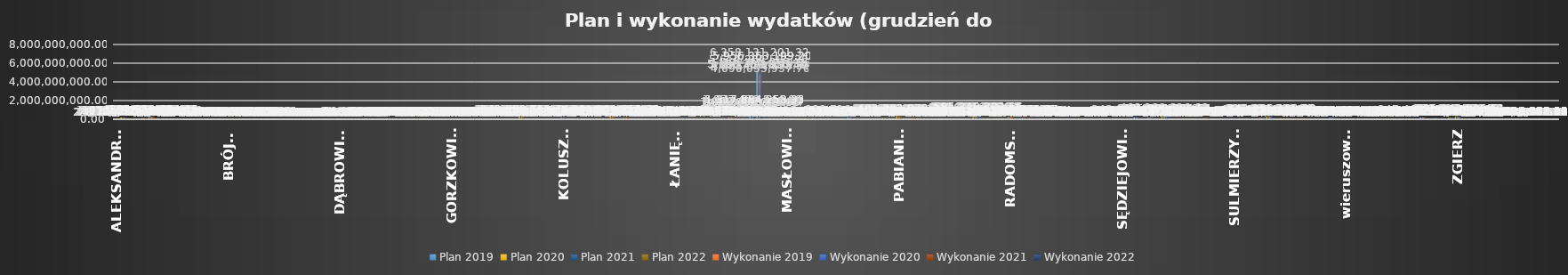
| Category | Plan 2019 | Plan 2020 | Plan 2021 | Plan 2022 | Wykonanie 2019 | Wykonanie 2020 | Series 2 | Series 5 | Wykonanie 2021 | Series 8 | Wykonanie 2022 |
|---|---|---|---|---|---|---|---|---|---|---|---|
| ALEKSANDRÓW | 23580725.07 | 24283173.98 | 27537382.62 | 32676022.12 | 22271493.37 | 24066873.37 |  |  | 25552603.27 |  | 28708478.08 |
| ALEKSANDRÓW ŁÓDZKI | 184972199.44 | 180178053.6 | 197245616.08 | 219583583.02 | 166173997.4 | 178610650.74 |  |  | 182521813.01 |  | 197213521.85 |
| ANDRESPOL | 79122338.95 | 78912447.79 | 90080146.39 | 125184037.34 | 70584346.09 | 78663948.52 |  |  | 78773892.19 |  | 112485549.13 |
| BEDLNO | 29792727.45 | 27233313.84 | 35072441.68 | 50634232.06 | 21806286.3 | 26307018.49 |  |  | 29071427.36 |  | 42759766.91 |
| bełchatowski | 136216881 | 133661317 | 141559567 | 161112251 | 130062824.21 | 132177891.32 |  |  | 136943414.59 |  | 151251469.93 |
| BEŁCHATÓW | 276406011.28 | 288220387.32 | 314438524.58 | 306308675.43 | 272544424.07 | 290809945.13 |  |  | 307808002.97 |  | 299950684.46 |
| BEŁCHATÓW | 61380115.67 | 61840947.8 | 81046335.77 | 156033262.29 | 57992327.34 | 63258396.24 |  |  | 74722805.64 |  | 135560681.76 |
| BĘDKÓW | 15093048 | 17043086.99 | 19072343.44 | 26302219.78 | 14201049.88 | 16683513.2 |  |  | 17406313.6 |  | 23356375.4 |
| BIAŁA | 28893162.06 | 31385929.56 | 36113319.29 | 45841363.47 | 26795207.95 | 31261073.66 |  |  | 33957840.69 |  | 42199553.38 |
| BIAŁA RAWSKA | 61924529.69 | 59863821.91 | 68490581.93 | 89918024.73 | 58937192.75 | 59772995.2 |  |  | 64713093.93 |  | 83390328.24 |
| BIAŁACZÓW | 29136839.38 | 30555957.88 | 38440593.59 | 51104979.43 | 27920334.63 | 30753871.23 |  |  | 34094807.98 |  | 45102223.98 |
| BIELAWY | 25785257.62 | 28711476.21 | 32500070.28 | 40616334.34 | 24614990.49 | 28228588.1 |  |  | 27286196.34 |  | 38277179.95 |
| BŁASZKI | 69507036.89 | 74040650.69 | 79127086.33 | 115109392.75 | 66147073.63 | 72879891.24 |  |  | 75646966.87 |  | 106016785.26 |
| BOLESŁAWIEC | 19864694.42 | 20783357.15 | 21973910.8 | 25908922.83 | 19075303.09 | 21157952.69 |  |  | 21080015.65 |  | 24687075.83 |
| BOLIMÓW | 19780506.46 | 26064648.91 | 27629882.99 | 34502399.81 | 18544383.13 | 23843984.79 |  |  | 25382657.86 |  | 32285854.58 |
| BRĄSZEWICE | 26115750.07 | 27307325.32 | 32366126.06 | 40622897.66 | 24634053.28 | 26641267.42 |  |  | 28276403.8 |  | 34154245.23 |
| BRÓJCE | 39494108.33 | 37951665.97 | 43238002.21 | 53748642.63 | 36640643.34 | 37444910.64 |  |  | 40928506.51 |  | 49536671.35 |
| BRZEZINY | 60755817.43 | 72616715.72 | 67478325.36 | 102360496.77 | 58623558 | 69434389.27 |  |  | 61181819.85 |  | 91568777.55 |
| BRZEZINY | 27752344.38 | 28326717.47 | 38834396.7 | 51311495.21 | 24961750.63 | 29372321.23 |  |  | 28178670.44 |  | 40145497.64 |
| brzeziński | 37763620.28 | 38359205.15 | 44744721.39 | 70852751.89 | 36358207.62 | 37796640.87 |  |  | 41888239.42 |  | 62854629.92 |
| BRZEŹNIO | 34960954.92 | 32248112.37 | 34900839.52 | 48944546.85 | 32480306.41 | 31025936.34 |  |  | 29221612.82 |  | 44866727.68 |
| BUCZEK | 28464346.35 | 25941760.67 | 31670341.16 | 38682894.52 | 26651552.11 | 25639516.06 |  |  | 28278541.18 |  | 34454421.11 |
| BUDZISZEWICE | 12351581.88 | 12364997.08 | 16077009.12 | 24380467.44 | 10866428.2 | 11566737.52 |  |  | 11549956.95 |  | 20535194.05 |
| BURZENIN | 27767729.3 | 30157791.76 | 35003161.13 | 41342289.01 | 26622723.05 | 29765797.48 |  |  | 32498789.75 |  | 38718100.55 |
| CHĄŚNO | 14895372.52 | 16167667.72 | 17525907.51 | 30045296.23 | 14469359.96 | 15950442.31 |  |  | 15102007.93 |  | 27019755.94 |
| CIELĄDZ | 19563451.95 | 22118666.93 | 24635181.72 | 32826627.98 | 18372656.32 | 22001855.24 |  |  | 22645870.24 |  | 30628110.13 |
| CZARNOCIN | 23389343.87 | 24333471.56 | 28782305.28 | 35122950.02 | 22129296.99 | 24825490.44 |  |  | 26718774.42 |  | 31438999.23 |
| CZARNOŻYŁY | 25426980.15 | 20566041.84 | 25746532.51 | 38645056.16 | 23893841.23 | 20437799.72 |  |  | 23442248.06 |  | 34277752.29 |
| CZASTARY | 17991567.03 | 20191797.52 | 23106530.25 | 35475610.71 | 17561803.32 | 19966970.04 |  |  | 22301599.66 |  | 34574622.35 |
| CZERNIEWICE | 31075864.21 | 31739983.19 | 44058386.87 | 35665433.58 | 29925721.83 | 31874917.51 |  |  | 41733832.56 |  | 32821353.98 |
| DALIKÓW | 32255434.75 | 25715308.72 | 28646546.57 | 37084309.65 | 31133444.97 | 26434715.23 |  |  | 27248602.95 |  | 33812253.68 |
| DASZYNA | 38417339.5 | 41217931.77 | 38061515.95 | 41560198.67 | 36067293.66 | 28391948.92 |  |  | 32911512.58 |  | 33560621.59 |
| DĄBROWICE | 13491857.81 | 14062063.66 | 14213797.06 | 21808241.16 | 11330373.53 | 16076353.88 |  |  | 12534206.88 |  | 16848276.67 |
| DŁUTÓW | 26305217.97 | 25768925.72 | 28337445.67 | 40596974.88 | 25467384.74 | 25639884.28 |  |  | 25166020.08 |  | 35055383.93 |
| DMOSIN | 25255572.02 | 24026281.73 | 25286172.57 | 43207905.97 | 24711015.56 | 23859035.84 |  |  | 24210010.83 |  | 37670531.16 |
| DOBROŃ | 40361218.5 | 44429007.53 | 45111481.03 | 60265048.14 | 37742266.47 | 44952020.33 |  |  | 41260078.05 |  | 56984576.37 |
| DOBRYSZYCE | 23425902.45 | 24065433.68 | 33290728.68 | 38656803.73 | 22081013.38 | 23759063.76 |  |  | 31100191.46 |  | 35972038.73 |
| DOMANIEWICE | 24557606.87 | 23633191.61 | 29313501.24 | 34881418.6 | 22182537.98 | 23952385.47 |  |  | 26743547.38 |  | 31365813.36 |
| DRUŻBICE | 26832765.47 | 30362930.89 | 31164994.43 | 42654845.71 | 25572323.61 | 29984782.1 |  |  | 30102024.31 |  | 39111677.21 |
| DRZEWICA | 49994624.32 | 50401829.04 | 59624582.17 | 64890265.21 | 46645716.76 | 49969854.17 |  |  | 50963957.14 |  | 59945372.27 |
| DZIAŁOSZYN | 66817175.89 | 66618656.37 | 71559601.74 | 94427409.02 | 65145081.86 | 67523689.83 |  |  | 68472309.71 |  | 88622582.76 |
| GALEWICE | 39170132.94 | 34749706.01 | 44974858.44 | 48278997.4 | 37273963.12 | 34485670.7 |  |  | 41547928.6 |  | 42946461.08 |
| GIDLE | 27910555.92 | 29816534.07 | 35729668 | 46037401.31 | 25942586.09 | 29902982.66 |  |  | 31620453.79 |  | 43623621.45 |
| GŁOWNO | 59247908.42 | 65336933.7 | 70849016.62 | 87491331.68 | 56817055.31 | 64049248.64 |  |  | 67088444.12 |  | 81637019.57 |
| GŁOWNO | 22811720.4 | 27052714.57 | 27937077.39 | 34217369.88 | 21081303.34 | 24728441.74 |  |  | 24542247.11 |  | 31976237.83 |
| GŁUCHÓW | 29326989.52 | 34461084.59 | 47543600.23 | 52178966.26 | 27460839.99 | 32922737.61 |  |  | 41204355.54 |  | 48323683.44 |
| GODZIANÓW | 14150514.62 | 18320556.31 | 21460508.43 | 20710727.63 | 13502530.13 | 18083270.16 |  |  | 19920757.63 |  | 19325210.04 |
| GOMUNICE | 30319845.3 | 33382471.09 | 41099279.76 | 42907753.4 | 29153143.93 | 32067919.1 |  |  | 38992732.68 |  | 41374263.62 |
| GORZKOWICE | 40689557.06 | 43597611.01 | 52103713 | 64342641.28 | 38170685.23 | 42552933.17 |  |  | 46946237.23 |  | 55638984.9 |
| GOSZCZANÓW | 29357253.8 | 28610349.6 | 31056552.7 | 51863014.52 | 26650988.19 | 27751825.89 |  |  | 29184353.36 |  | 44778869.19 |
| GÓRA ŚW. MAŁGORZATY | 21560299.64 | 23818156.1 | 25206962.94 | 28462964.01 | 20476139.34 | 23693145.31 |  |  | 23896082.26 |  | 25859695.74 |
| GRABICA | 39777221.05 | 40873255.58 | 44320246.59 | 62129300.87 | 36503441.95 | 39544917.27 |  |  | 37230631.93 |  | 53056366.3 |
| GRABÓW | 27111258.96 | 30347231.94 | 31343144.82 | 50261655.09 | 26047430.51 | 29865470.18 |  |  | 29310837.59 |  | 47773899.05 |
| INOWŁÓDZ | 32808809.2 | 28906834.27 | 30555015.79 | 34747109.57 | 31188880.42 | 28921138.41 |  |  | 27683105.52 |  | 30998262.95 |
| JEŻÓW | 18364648.25 | 19123863.1 | 20370032.28 | 32953406.12 | 17713814.42 | 18863247.47 |  |  | 19161791.66 |  | 28992951.89 |
| KAMIEŃSK | 39933074.51 | 38303504.72 | 65320908.27 | 81389743.78 | 36594279.33 | 38663375.87 |  |  | 60204311.6 |  | 73883097.66 |
| KIEŁCZYGŁÓW | 20151545.56 | 20049475.78 | 23566605.62 | 31636663.59 | 18510434.47 | 19511704.73 |  |  | 21054796.34 |  | 28888038.75 |
| KIERNOZIA | 19248213.73 | 20173733.28 | 22920908.21 | 36047183.18 | 18127407.67 | 19701061.78 |  |  | 21403970.71 |  | 32120866.56 |
| KLESZCZÓW | 290343308.07 | 276230061.33 | 319086597.23 | 264558104.64 | 259139323.25 | 261248951.51 |  |  | 283739353.34 |  | 243888719.74 |
| KLONOWA | 15124318.55 | 18004648.55 | 17896454.59 | 24044622.63 | 14207237.27 | 17826643.83 |  |  | 17196008.99 |  | 23339132.74 |
| KLUKI | 21922930.62 | 22560305.26 | 25824988.94 | 37815164.92 | 20294012.23 | 21978508.67 |  |  | 24177628.29 |  | 30563392.33 |
| KOBIELE WIELKIE | 20630834.56 | 21905205.06 | 22775961.98 | 28665080.48 | 19558942.34 | 21709292.15 |  |  | 21614837.63 |  | 27047499.65 |
| KOCIERZEW POŁUDNIOWY | 19978283.63 | 22386394 | 24472403.15 | 41330748.71 | 19090474.29 | 22233137.74 |  |  | 21329987.82 |  | 37583267.19 |
| KODRĄB | 24926166.79 | 22514653.04 | 28983222.26 | 28057060.63 | 23886922.6 | 22208448.25 |  |  | 27030793.05 |  | 26356199.08 |
| KOLUSZKI | 148360027.96 | 131953610.5 | 142047810.7 | 168711933.94 | 135187248.96 | 125292687.73 |  |  | 130648851.25 |  | 153547422.27 |
| KONOPNICA | 21739477.67 | 20513754.86 | 25042144.83 | 32610489 | 21122392.43 | 20363192.58 |  |  | 24029447.62 |  | 29673755.44 |
| KONSTANTYNÓW ŁÓDZKI | 88732394.86 | 95209453.74 | 107783879.27 | 113736142.45 | 83515044.77 | 93146943.75 |  |  | 100875135.15 |  | 102531815.83 |
| KOWIESY | 17259469.52 | 17544629.84 | 19704630.86 | 25920787.44 | 16779312.16 | 17406283.04 |  |  | 18274393.62 |  | 24285818.75 |
| KROŚNIEWICE | 44874781.45 | 42085142.92 | 48763096.4 | 66147326.85 | 41223040.83 | 41923035.7 |  |  | 46309503.97 |  | 60882603.66 |
| KRZYŻANÓW | 26055948.47 | 23716554.83 | 27165664.25 | 44822579.84 | 25096200.48 | 24165507.73 |  |  | 18264759.51 |  | 39456568.52 |
| KSAWERÓW | 54894131.25 | 54137935.71 | 68715666.78 | 68005502.98 | 45242262.95 | 53861774.74 |  |  | 61862639.47 |  | 53309263.76 |
| KUTNO | 239179659.98 | 256693393.17 | 261822461.04 | 288396156.21 | 221201157.06 | 243406569.14 |  |  | 243456058.77 |  | 264160015.39 |
| KUTNO | 41710974.23 | 45397825.21 | 52685289.34 | 62315524.63 | 39740937.45 | 45289992.69 |  |  | 50396086.61 |  | 58008710.09 |
| kutnowski | 132593386.61 | 137448119.42 | 150318951.38 | 178947427.06 | 124347364.92 | 135761631.07 |  |  | 142073893.72 |  | 163590810.48 |
| LGOTA WIELKA | 26256734.62 | 26311550.87 | 31196506.76 | 35401589.62 | 24956870.69 | 25732552.89 |  |  | 28944410.39 |  | 30591051.36 |
| LIPCE REYMONTOWSKIE | 18525179.92 | 22115332.6 | 30790805.33 | 28124378.58 | 15952935.14 | 20305604.86 |  |  | 21504963.61 |  | 23416117.53 |
| LUBOCHNIA | 51535346.61 | 53147420.65 | 50654835.78 | 56923266.48 | 48324830.92 | 52555288.88 |  |  | 46161294.73 |  | 50224092.21 |
| LUTOMIERSK | 43055415.31 | 45571643.39 | 57304580.86 | 66150984.67 | 39808459.19 | 45068352.23 |  |  | 45159200.89 |  | 52600423.54 |
| LUTUTÓW | 27682575.32 | 25334382.23 | 32853704.3 | 42839036.07 | 25528245.93 | 25242080.96 |  |  | 27974736.35 |  | 38671490.65 |
| ŁADZICE | 30473549.96 | 24498291.38 | 25091807.99 | 35369615.72 | 28198549.96 | 24406431.2 |  |  | 23665861.94 |  | 31749804.77 |
| ŁANIĘTA | 11938224.6 | 13939194.1 | 18034303.08 | 34989213.46 | 10860393.76 | 13242213.9 |  |  | 14916987.73 |  | 16198280.73 |
| ŁASK | 132040739.91 | 125129776.83 | 141849644.65 | 171490513.43 | 125919010.64 | 123064319.66 |  |  | 133662132.62 |  | 153343281.47 |
| łaski | 51450902.4 | 50489721.05 | 65032075.6 | 67764002.14 | 47867218.16 | 50610086.52 |  |  | 58132326.75 |  | 56991344.57 |
| ŁĘCZYCA | 73230697 | 72288233.97 | 78502451.6 | 78976814.46 | 69717223.44 | 71864741.13 |  |  | 74717961.29 |  | 71950751.99 |
| ŁĘCZYCA | 43914718.13 | 52724606.05 | 52719332.33 | 64124242.29 | 39905461.82 | 48519153.79 |  |  | 43142216.16 |  | 55407110.92 |
| łęczycki | 63508287.17 | 67965211.51 | 75675273.39 | 86321142.41 | 60235412.59 | 65989096.08 |  |  | 70142241.54 |  | 79955019.12 |
| ŁĘKI SZLACHECKIE | 16149154.66 | 19058658.7 | 19590138.18 | 29795429.51 | 15396527.66 | 18277286.37 |  |  | 17888563.7 |  | 25606918.66 |
| łowicki | 106424869.47 | 103361567.03 | 124401838.45 | 144572914.45 | 99548684.99 | 100850796.05 |  |  | 104332796.16 |  | 126174683.27 |
| ŁOWICZ | 162207954.31 | 178930916.72 | 183744635.43 | 200099497.02 | 152708558.58 | 177879300.05 |  |  | 165382672.6 |  | 182573898.22 |
| ŁOWICZ | 47225093.08 | 45178932.43 | 48172430.86 | 60691099.62 | 43826093.73 | 44789882.13 |  |  | 42132513.52 |  | 55628150.88 |
| łódzki wschodni | 67473947.45 | 78161635.58 | 85616408.23 | 111232405.49 | 61065549.14 | 78291553.81 |  |  | 74158652.23 |  | 95349740.55 |
| łódzkie | 1065060099 | 1093106329 | 1169420446 | 1377470544 | 956883138.51 | 1097732100.67 |  |  | 1066808157.47 |  | 1317884253.33 |
| Łódź | 5156257815.51 | 5086453850.49 | 5614364585.36 | 6358131201.32 | 4690053937.7 | 4921024478.31 |  |  | 5227945218.36 |  | 5956363199.2 |
| ŁUBNICE | 22412388.97 | 23788023.48 | 22514808.1 | 27048950.14 | 21657320.55 | 23307147.67 |  |  | 21282501.22 |  | 24816974.87 |
| ŁYSZKOWICE | 37268731.86 | 33693201.03 | 44118945.72 | 46177801.93 | 33442976.07 | 32825546.35 |  |  | 34856631.91 |  | 40737196.9 |
| MAKÓW | 40950081.17 | 42441604 | 43279521.42 | 45434902.12 | 36897295.44 | 42565994.87 |  |  | 38283322.08 |  | 37608972.2 |
| MASŁOWICE | 22943413.34 | 25237995.34 | 24311200.79 | 32265154.7 | 20794052.67 | 25199037.02 |  |  | 21888490.52 |  | 30345281.44 |
| MNISZKÓW | 23668171.59 | 27097370.92 | 30115663.17 | 34656832.64 | 22118483.45 | 25375369.05 |  |  | 27553355.77 |  | 31899362.88 |
| MOKRSKO | 26122853.4 | 30013239.49 | 32906588.02 | 44437800.45 | 24957617.22 | 29796298.2 |  |  | 31670346.24 |  | 41161700.25 |
| MOSZCZENICA | 73216437.19 | 74066374.8 | 89943779.24 | 106232809.27 | 68262857.59 | 70088864.8 |  |  | 81898159.03 |  | 100886351.98 |
| NIEBORÓW | 49241051.78 | 47220602.53 | 53988597.06 | 69113891.43 | 46340766.5 | 47422279.58 |  |  | 51021889.43 |  | 61636236.66 |
| NOWA BRZEŹNICA | 21864756.3 | 23606799.49 | 31555380.71 | 46937694.91 | 21417404.68 | 23965597.91 |  |  | 25015368.3 |  | 28971339.05 |
| NOWE OSTROWY | 19341004.35 | 19745738.73 | 20563516.45 | 38436239.36 | 17380837.35 | 19635398.9 |  |  | 18782828.52 |  | 32943629.83 |
| NOWOSOLNA | 36198051.26 | 36942608.31 | 46879089.08 | 50478411.32 | 32865357.97 | 36898176.41 |  |  | 42415663.76 |  | 46946264.35 |
| NOWY KAWĘCZYN | 16988372.57 | 18740131.52 | 20890186.98 | 24333848.62 | 16562299.55 | 18446475.55 |  |  | 20294733.94 |  | 23688596.29 |
| OPOCZNO | 158503598.06 | 164629247.4 | 232493883.17 | 239716134.18 | 150510195.58 | 159538774.09 |  |  | 209072247.7 |  | 215124129.79 |
| opoczyński | 89196212 | 90522778.04 | 102578670.24 | 114489934.2 | 80632730.96 | 90233606.18 |  |  | 92852810.52 |  | 103924350.69 |
| OPORÓW | 13477737.7 | 14350337.82 | 13986339.58 | 18196106.84 | 12537139.28 | 14073590.4 |  |  | 12917037.55 |  | 13692041.29 |
| OSJAKÓW | 31983509.46 | 29376791.63 | 34755238 | 48392845.88 | 29239381.61 | 29788035.24 |  |  | 30562549.73 |  | 41138486.75 |
| OSTRÓWEK | 22553293.6 | 23541716.99 | 27263291.26 | 46412338.4 | 21582127.02 | 23706634.78 |  |  | 25911056.99 |  | 42786629.4 |
| OZORKÓW | 102303054.78 | 109522525.26 | 104986096.65 | 113178093.56 | 97935581.58 | 100009924.23 |  |  | 98933568.12 |  | 107389908.87 |
| OZORKÓW | 36331965.72 | 37772163.91 | 40086772.33 | 48692870.32 | 32300717.42 | 37888933.55 |  |  | 36012177.69 |  | 44672124.05 |
| PABIANICE | 329670796.72 | 348941828.43 | 386361621.85 | 427451679.18 | 293029232.53 | 310008592.28 |  |  | 363783090.68 |  | 403262079.31 |
| PABIANICE | 55896459.61 | 54161354.08 | 63834593.06 | 69228361.01 | 53656495.02 | 53513339.74 |  |  | 56678267.6 |  | 62545519.37 |
| pabianicki | 119538064.91 | 119838375.67 | 131717347.9 | 142774789.37 | 114483354 | 119607623.62 |  |  | 122342492.31 |  | 135042833.95 |
| pajęczański | 51843124.82 | 48737738.62 | 59170100.96 | 65019510.02 | 49029042.21 | 48697811.1 |  |  | 54909468.95 |  | 62137660.32 |
| PAJĘCZNO | 51767642.07 | 59569446.3 | 69674624.95 | 80566288.18 | 47906750.8 | 59242929.17 |  |  | 59724661.55 |  | 70549619.69 |
| PARADYŻ | 26671126.53 | 34730239.39 | 31321296.68 | 40083051.27 | 25951874.79 | 34200023.11 |  |  | 30327367.76 |  | 39037608.33 |
| PARZĘCZEW | 29737441.48 | 29312322.32 | 29642834.04 | 48684394.47 | 27784299.65 | 29541009.6 |  |  | 28250809.96 |  | 39712575.01 |
| PĄTNÓW | 37600921.24 | 33191742.22 | 35224112.53 | 50450862.83 | 34408183.86 | 33127115.93 |  |  | 30900563.3 |  | 45336155.05 |
| PĘCZNIEW | 22027798.17 | 19359975.7 | 21567689.48 | 32119621.23 | 19911219.61 | 18470787.71 |  |  | 20603678.6 |  | 30229524.9 |
| PIĄTEK | 30405452.27 | 33725192 | 34405285.88 | 45082089.9 | 28320273.9 | 32951471.02 |  |  | 32379410.94 |  | 42298931.19 |
| piotrkowski | 95381122.97 | 81335972.71 | 103617182.25 | 111533219.65 | 85538168.16 | 80639996.71 |  |  | 90751395.52 |  | 104282078.77 |
| Piotrków Trybunalski | 502633363.98 | 521891117.52 | 556309185.54 | 610523799.52 | 486765146.77 | 525491848.42 |  |  | 530366027.73 |  | 585348302.56 |
| PODDĘBICE | 111305279.44 | 101924644.23 | 85513197.25 | 120238753.29 | 107787082.36 | 102104081.36 |  |  | 77970654.62 |  | 103421577.85 |
| poddębicki | 49244436.99 | 48738714.67 | 54853645.31 | 65657661.76 | 47386116.77 | 47872273.97 |  |  | 48067149.1 |  | 59477487.1 |
| POŚWIĘTNE | 17465245.4 | 15859875.94 | 17430084.51 | 26474705.29 | 16175837.86 | 15904629.06 |  |  | 15709392.73 |  | 24165299.09 |
| PRZEDBÓRZ | 37765318.15 | 38192131.07 | 38119910.59 | 51744859.94 | 36070010.31 | 37766024.92 |  |  | 37015537.67 |  | 49048138.4 |
| RADOMSKO | 266044105.68 | 234266117.63 | 278681125.22 | 307282459.08 | 242510898.69 | 246109867.85 |  |  | 253382346 |  | 281496806.37 |
| RADOMSKO | 29088155.03 | 30081395.11 | 39139525.58 | 46151841.5 | 27618312.06 | 29585172.15 |  |  | 35726319.24 |  | 41987396.78 |
| radomszczański | 130888393.5 | 128057773.27 | 141777979.36 | 166568346.91 | 117684611.22 | 126823306.21 |  |  | 130181952.14 |  | 153991842.24 |
| RAWA MAZOWIECKA | 102239926.85 | 109161339.48 | 130063395.11 | 133486738.97 | 96005264.5 | 101915466.5 |  |  | 112391532.18 |  | 125464919 |
| RAWA MAZOWIECKA | 46957489.46 | 46864264.81 | 56689396.77 | 75138334.98 | 42916162.57 | 49726975.58 |  |  | 52641760.03 |  | 67710756.45 |
| rawski | 75381564 | 71216613 | 92127572 | 123320605.88 | 70675562.88 | 67858236.61 |  |  | 84685349.09 |  | 112792282.8 |
| REGNÓW | 8868526.6 | 9844929.44 | 11017166.87 | 20369737.36 | 8624436.19 | 9644619.13 |  |  | 9914039.5 |  | 19169054.49 |
| RĘCZNO | 18412171.99 | 17326611.9 | 19784877.85 | 23065031.47 | 17523729.58 | 16989600.87 |  |  | 17879454.07 |  | 20818212.95 |
| ROGÓW | 24633268.1 | 24680257.05 | 28950776.81 | 38677987.15 | 23538638.93 | 24691297.45 |  |  | 27646495.31 |  | 35394804.69 |
| ROKICINY | 36512704.69 | 33960680.67 | 38816735.2 | 47684952.73 | 31945515.62 | 34352945.63 |  |  | 33991633.48 |  | 42319623.3 |
| ROZPRZA | 64587799.47 | 63114927.89 | 76140519.61 | 83194483.27 | 59539596.76 | 62047857.48 |  |  | 70156251.07 |  | 73816174.96 |
| RUSIEC | 24502768 | 25990000 | 29650000 | 46252126.78 | 23356088.77 | 26124303.65 |  |  | 28892072.4 |  | 44815445.2 |
| RZĄŚNIA | 61572544.73 | 55010143.96 | 74588539.16 | 71859790.21 | 54411066.97 | 55430090.57 |  |  | 62324192.14 |  | 62095348.99 |
| RZECZYCA | 35500152 | 34943230 | 34626085 | 53079422 | 31478923.51 | 28308183.8 |  |  | 27759404.48 |  | 42092800.19 |
| RZGÓW | 105261216.96 | 77466285.11 | 81117846.58 | 97931277.62 | 100432620.36 | 81356742.57 |  |  | 72088649.74 |  | 87406766.37 |
| SADKOWICE | 26790741.6 | 29357261.59 | 31619571.48 | 46177615.94 | 25981387.49 | 29247799.38 |  |  | 29370404.53 |  | 40191450.9 |
| SĘDZIEJOWICE | 33465441.33 | 36116778.09 | 42921591.72 | 48975022.73 | 29265721.55 | 35220719.72 |  |  | 41180664.95 |  | 45526328.33 |
| SIEMKOWICE | 26659800.98 | 26525670.81 | 28225666.76 | 35855802.63 | 24427337.9 | 26245508.06 |  |  | 27149247.46 |  | 33664668.7 |
| SIERADZ | 193020105.74 | 197560148.97 | 225804851.07 | 242975998.37 | 178506428.58 | 196631465.5 |  |  | 209466421.72 |  | 221904035.99 |
| SIERADZ | 50562254.52 | 59182897.11 | 64676023.78 | 84495724.34 | 48495313.38 | 58271054.84 |  |  | 60382132.41 |  | 75679576.21 |
| sieradzki | 155707482.45 | 164729581.06 | 170901099.92 | 190914964.56 | 144480832.23 | 162522709.06 |  |  | 160833829.42 |  | 174596109.45 |
| SKIERNIEWICE | 43742246.2 | 50519533.02 | 54583769.72 | 68477605.75 | 40438272.18 | 49340048.23 |  |  | 51726249.28 |  | 61176003.49 |
| SKIERNIEWICE | 335293057.86 | 367069537.74 | 395302403.66 | 469199816.68 | 313317560.61 | 361812640.29 |  |  | 375297682.4 |  | 425938386.54 |
| skierniewicki | 29150001 | 31473192 | 30958352 | 58056753.52 | 27508549.82 | 30696078.38 |  |  | 28856125.53 |  | 52172090.55 |
| SKOMLIN | 16678595.61 | 20520966.43 | 23425663.19 | 26246815.29 | 14900344.08 | 19318437.75 |  |  | 20165639.77 |  | 22228852.32 |
| SŁAWNO | 44456283.31 | 41867622.9 | 43589298.78 | 53283006 | 43781399.48 | 41933138.49 |  |  | 41614194.25 |  | 51318160.01 |
| SŁUPIA | 15444847.62 | 14162241.98 | 14275928.7 | 20687840.38 | 13376570.09 | 13502021.12 |  |  | 12602824.01 |  | 17374332.66 |
| SOKOLNIKI | 38146143.2 | 29253321.19 | 32656659.26 | 43728465.1 | 34648050.86 | 29957149.06 |  |  | 26692034.96 |  | 39106594.79 |
| STRYKÓW | 108594454.11 | 109127890.86 | 119798354.74 | 145224402.18 | 95083895.24 | 110828795.4 |  |  | 109346827.04 |  | 118913704.66 |
| STRZELCE | 21426235.68 | 26633273.75 | 27323522.9 | 35275082.18 | 19197473.01 | 26202567.06 |  |  | 21980531.21 |  | 29796181.95 |
| STRZELCE WIELKIE | 24733043.34 | 23400288.97 | 27170308.67 | 37088837.68 | 22854575.55 | 22785731.08 |  |  | 24893560.51 |  | 34552211.12 |
| SULEJÓW | 102904201.31 | 89196985.04 | 116468403.62 | 128915528.53 | 76699121.43 | 88884202.77 |  |  | 106052987.33 |  | 111264642.8 |
| SULMIERZYCE | 52053302.95 | 50308706.23 | 62481960.09 | 100317268.89 | 49002751.07 | 51106639.31 |  |  | 54965278.2 |  | 88808246.35 |
| SZADEK | 35748763.43 | 36200477.33 | 41230601.05 | 50854845 | 33623967.94 | 35745427.34 |  |  | 38620771.79 |  | 47709744.74 |
| SZCZERCÓW | 72230336.79 | 85512766.29 | 83539869.04 | 105911234.05 | 66511429.18 | 86016577.67 |  |  | 73827886.49 |  | 91380638.19 |
| ŚWINICE WARCKIE | 21870058.15 | 20247219.44 | 21116352.01 | 27745146.55 | 18567791.34 | 22290653.92 |  |  | 19855629.57 |  | 25226033.94 |
| tomaszowski | 143665613.5 | 159858694.96 | 188086707.07 | 176127169.65 | 135494714.81 | 157639606.32 |  |  | 182476631.6 |  | 170937406.63 |
| TOMASZÓW MAZOWIECKI | 313735365.53 | 314158755.63 | 312691046.73 | 355954890.58 | 308412733.27 | 313400574.8 |  |  | 302593791.13 |  | 342266162.3 |
| TOMASZÓW MAZOWIECKI | 70448522.48 | 70227401.5 | 73523981.05 | 88763002.19 | 63719873.11 | 67178983.79 |  |  | 68046133.95 |  | 79264514.69 |
| TUSZYN | 69077815.36 | 75480276.4 | 85327568.93 | 91292400.36 | 63792086.77 | 71821417.24 |  |  | 72141068.36 |  | 80972565.59 |
| UJAZD | 46926079.32 | 54220799.03 | 67632972.92 | 78973440.03 | 45089800.06 | 54628191.61 |  |  | 64172297.51 |  | 74431076.42 |
| UNIEJÓW | 103571358.68 | 57822273.82 | 89787939.65 | 108075757.81 | 91607831.16 | 55903858.31 |  |  | 73287449.57 |  | 78431129.62 |
| WARTA | 75909349.6 | 67109474.2 | 73805405.82 | 107278512.52 | 72742557.04 | 66038917.67 |  |  | 66543814.77 |  | 101103872.21 |
| WARTKOWICE | 36214750.28 | 40920761.86 | 45648237.98 | 65851324.48 | 33891435.87 | 38853676.75 |  |  | 37730950.34 |  | 54939094.19 |
| WIDAWA | 39632554.32 | 41680994.78 | 43163671.19 | 62560899.71 | 33948029.97 | 40111234.97 |  |  | 39899410.84 |  | 52162370.73 |
| WIELGOMŁYNY | 23481233.87 | 23622444.14 | 25763533.6 | 37607054.8 | 21628013.05 | 24317534 |  |  | 24350066.37 |  | 34533133.53 |
| WIELUŃ | 159310896.35 | 155805708.79 | 189168354.43 | 185170822.22 | 149803357.4 | 156240511.04 |  |  | 160834752.87 |  | 168513010.41 |
| wieluński | 103977209.87 | 103922499.83 | 117495984.16 | 140331773.58 | 100881505.32 | 103283944.7 |  |  | 107820373.12 |  | 134178248.99 |
| wieruszowski | 45697592 | 60779750 | 59609021 | 63648863.79 | 44020123.91 | 60362482.63 |  |  | 57036791.55 |  | 60088424.22 |
| WIERUSZÓW | 82833416.49 | 77170591.67 | 88503022.88 | 102405168.83 | 76790372.42 | 73721663.06 |  |  | 83795674.19 |  | 92788494.06 |
| WIERZCHLAS | 49122360.98 | 36798992.15 | 46995584.26 | 52752502.09 | 45005757.1 | 34562270.88 |  |  | 39413004.2 |  | 45330773.56 |
| WITONIA | 15033519.23 | 16808828.4 | 20733222.15 | 29566747.97 | 13886785.5 | 15518299.33 |  |  | 17427715.21 |  | 23985572.03 |
| WODZIERADY | 22408878.33 | 22424563.33 | 29573982.99 | 31196603.58 | 17418107.68 | 19248279.11 |  |  | 24557774.3 |  | 27730917.07 |
| WOLA KRZYSZTOPORSKA | 63067990.29 | 70927445.66 | 78886201.65 | 93719483.94 | 60100675.04 | 72304504.61 |  |  | 68980973.41 |  | 84066185.11 |
| WOLBÓRZ | 50853896.31 | 52509433.22 | 60961154.65 | 68174592.05 | 49640472.16 | 54827435.79 |  |  | 57787121.85 |  | 64919693.29 |
| WRÓBLEW | 28722171.37 | 34646164.13 | 33318433.17 | 54732757.51 | 27324287.04 | 34262537.26 |  |  | 29569677.05 |  | 45627109.53 |
| ZADZIM | 27664355.4 | 27849752.32 | 27371257.54 | 33938098.51 | 26364971.36 | 28096042.46 |  |  | 25795117.81 |  | 32239247.53 |
| ZAPOLICE | 33272949.95 | 29489422.89 | 31731022.91 | 39884706.49 | 29388881.93 | 28339823.5 |  |  | 27572635.87 |  | 33808638.23 |
| ZDUNY | 26359544.24 | 32478325.22 | 35944319.9 | 46516191.59 | 24437708.38 | 30030092.15 |  |  | 31805177.55 |  | 43185077.98 |
| ZDUŃSKA WOLA | 190546677.81 | 189806890.49 | 222829903.61 | 247444773.61 | 183129669.76 | 187615526.41 |  |  | 208277481.69 |  | 228029298.92 |
| ZDUŃSKA WOLA | 61687630.49 | 62280894.52 | 66115976.36 | 91435452.25 | 59157385.65 | 64892989.5 |  |  | 60059596.03 |  | 112285073.08 |
| zduńskowolski | 129146349.8 | 103252929.2 | 108813469.6 | 127989569.96 | 121667296.83 | 103928059.37 |  |  | 104724835.44 |  | 121025922.56 |
| ZELÓW | 73383068.76 | 72822268.52 | 80306235.73 | 111194012.23 | 69577698.73 | 72587238.53 |  |  | 74765129.9 |  | 101566007.37 |
| zgierski | 151546039.62 | 171977792.5 | 209449596.48 | 207498760.81 | 146432540.26 | 168597695.35 |  |  | 192020402.31 |  | 192865069.71 |
| ZGIERZ | 289330248.1 | 298748486.33 | 354003186.51 | 358320988.45 | 257393821.66 | 296208422.04 |  |  | 329229905.77 |  | 335242836.51 |
| ZGIERZ | 72897340.2 | 76587674.52 | 87388562.91 | 109455734.85 | 70557865.54 | 76971136.82 |  |  | 82439153.74 |  | 98540769.14 |
| ZŁOCZEW | 37968402.72 | 37854063.68 | 45952678.14 | 60742397.74 | 34304347.14 | 38113975.8 |  |  | 43174945.08 |  | 53853978.6 |
| Związek Gmin Nadnerzańskich | 24744.98 | 24000 | 49796.02 | 58635.27 | 10555.35 | 24013.35 |  |  | 15160.75 |  | 15283.83 |
| Związek Gmin Powiatu Radomszczańskiego w Gidlach | 50900 | 26000 | 62000 | 27762.02 | 36469.14 | 26006.55 |  |  | 46195.82 |  | 20538.22 |
| Związek Gmin Regionu Kutnowskiego | 800975.16 | 8493959 | 10921465.14 | 10759050.05 | 649107.8 | 589126.11 |  |  | 1880892.35 |  | 5941466.16 |
| Związek Gmin Regionu Poddębickiego | 9752.56 | 15000 | 18390.71 | 20380.11 | 7586.79 | 15000 |  |  | 14510.6 |  | 16540.25 |
| Związek Gmin Ziemi Wieluńskiej | 149793.4 | 156640.9 | 322719.4 | 347003.4 | 108605.41 | 161914.2 |  |  | 132765.55 |  | 291332.04 |
| Związek Komunalny Gmin w Bełchatowie | 78000 | 30000 | 78000 | 78000 | 52475.72 | 25801.16 |  |  | 66728.37 |  | 68380.87 |
| Związek Międzygminny "Bzura" z siedzibą w Łowiczu | 15627529.76 | 1656689.38 | 17734658.42 | 11227909.77 | 934137.65 | 879142.22 |  |  | 1197547.36 |  | 1830113.62 |
| Związek Powiatów Województwa Łódzkiego z siedzibą w Piotrkowie Trybunalskim | 1697732.97 | 1955056.73 | 7417208.03 | 23401189.16 | 1382767.04 | 1911415.95 |  |  | 6003024.92 |  | 19736785.44 |
| ŻARNÓW | 29420946.54 | 35749453.21 | 36062984.8 | 45386739.43 | 27885943.76 | 33167637.31 |  |  | 33391614.86 |  | 38957554.29 |
| ŻELECHLINEK | 22687622.22 | 21671421.68 | 27800038.4 | 33549884.92 | 20308704.56 | 20780674.49 |  |  | 22667173.32 |  | 25652508.49 |
| ŻYCHLIN | 51562678.36 | 56068852.82 | 62147170.11 | 73310225.83 | 48336462.28 | 52858717.51 |  |  | 58886092.03 |  | 66626989.13 |
| ŻYTNO | 23299275.87 | 27638061.2 | 30086059.1 | 46833649.15 | 21682804.49 | 27169738.59 |  |  | 28315324.51 |  | 41519758.01 |